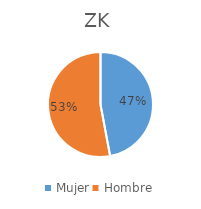
| Category | ZK |
|---|---|
| Mujer | 0.471 |
| Hombre | 0.529 |